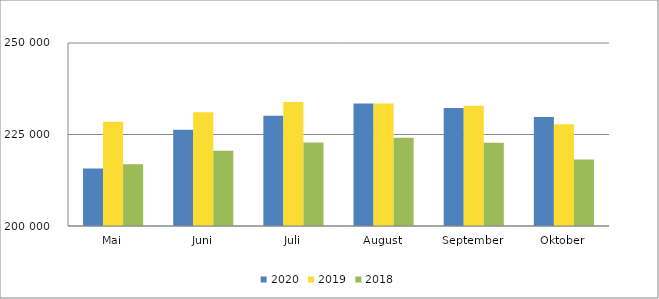
| Category | 2020 | 2019 | 2018 |
|---|---|---|---|
| Mai | 215701 | 228514 | 216876 |
| Juni | 226300 | 231048 | 220589 |
| Juli | 230123 | 233904 | 222783 |
| August | 233456 | 233468 | 224105 |
| September | 232266 | 232871 | 222727 |
| Oktober | 229785 | 227830 | 218166 |